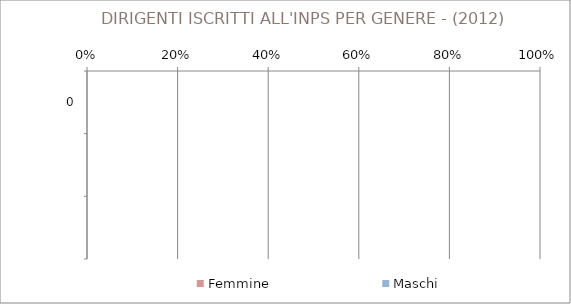
| Category | Femmine | Maschi |
|---|---|---|
| 0 | 0 | 0 |